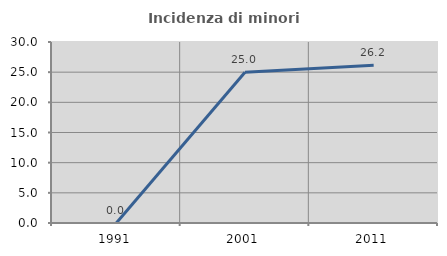
| Category | Incidenza di minori stranieri |
|---|---|
| 1991.0 | 0 |
| 2001.0 | 25 |
| 2011.0 | 26.154 |